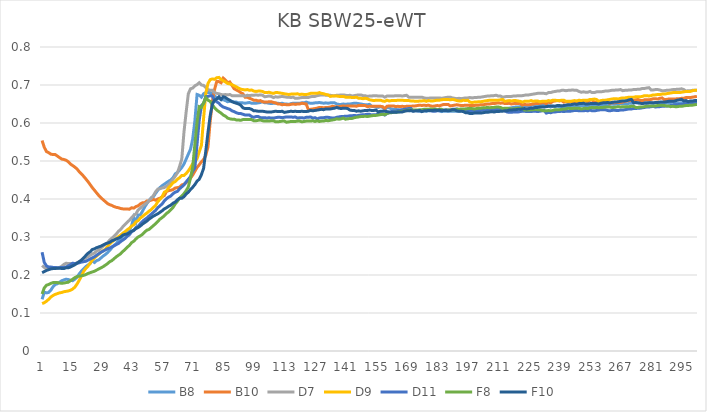
| Category | B8 | B10 | D7 | D9 | D11 | F8 | F10 |
|---|---|---|---|---|---|---|---|
| 0 | 0.136 | 0.554 | 0.225 | 0.125 | 0.26 | 0.15 | 0.206 |
| 1 | 0.155 | 0.536 | 0.22 | 0.127 | 0.233 | 0.166 | 0.209 |
| 2 | 0.153 | 0.525 | 0.217 | 0.131 | 0.224 | 0.173 | 0.212 |
| 3 | 0.154 | 0.522 | 0.218 | 0.136 | 0.221 | 0.175 | 0.214 |
| 4 | 0.16 | 0.518 | 0.218 | 0.142 | 0.221 | 0.178 | 0.216 |
| 5 | 0.169 | 0.517 | 0.217 | 0.146 | 0.22 | 0.18 | 0.217 |
| 6 | 0.175 | 0.517 | 0.217 | 0.149 | 0.22 | 0.18 | 0.217 |
| 7 | 0.177 | 0.513 | 0.218 | 0.151 | 0.219 | 0.18 | 0.218 |
| 8 | 0.181 | 0.509 | 0.22 | 0.153 | 0.219 | 0.179 | 0.218 |
| 9 | 0.185 | 0.505 | 0.223 | 0.154 | 0.22 | 0.178 | 0.217 |
| 10 | 0.187 | 0.504 | 0.228 | 0.156 | 0.22 | 0.179 | 0.217 |
| 11 | 0.189 | 0.502 | 0.231 | 0.157 | 0.221 | 0.18 | 0.219 |
| 12 | 0.188 | 0.498 | 0.23 | 0.158 | 0.224 | 0.181 | 0.219 |
| 13 | 0.186 | 0.492 | 0.23 | 0.16 | 0.227 | 0.185 | 0.221 |
| 14 | 0.185 | 0.488 | 0.23 | 0.163 | 0.231 | 0.189 | 0.224 |
| 15 | 0.189 | 0.484 | 0.23 | 0.168 | 0.23 | 0.193 | 0.227 |
| 16 | 0.194 | 0.479 | 0.232 | 0.176 | 0.231 | 0.196 | 0.231 |
| 17 | 0.203 | 0.472 | 0.235 | 0.186 | 0.232 | 0.197 | 0.235 |
| 18 | 0.21 | 0.466 | 0.239 | 0.197 | 0.234 | 0.198 | 0.239 |
| 19 | 0.216 | 0.46 | 0.242 | 0.209 | 0.235 | 0.199 | 0.245 |
| 20 | 0.222 | 0.453 | 0.245 | 0.217 | 0.236 | 0.201 | 0.251 |
| 21 | 0.226 | 0.446 | 0.248 | 0.223 | 0.239 | 0.204 | 0.257 |
| 22 | 0.23 | 0.438 | 0.252 | 0.231 | 0.242 | 0.206 | 0.261 |
| 23 | 0.238 | 0.43 | 0.255 | 0.239 | 0.245 | 0.208 | 0.267 |
| 24 | 0.233 | 0.423 | 0.258 | 0.245 | 0.248 | 0.21 | 0.269 |
| 25 | 0.238 | 0.416 | 0.263 | 0.25 | 0.252 | 0.213 | 0.272 |
| 26 | 0.24 | 0.409 | 0.266 | 0.255 | 0.256 | 0.216 | 0.274 |
| 27 | 0.245 | 0.403 | 0.271 | 0.26 | 0.26 | 0.219 | 0.276 |
| 28 | 0.25 | 0.398 | 0.276 | 0.264 | 0.263 | 0.222 | 0.279 |
| 29 | 0.254 | 0.393 | 0.281 | 0.268 | 0.266 | 0.226 | 0.282 |
| 30 | 0.259 | 0.388 | 0.285 | 0.275 | 0.269 | 0.23 | 0.284 |
| 31 | 0.265 | 0.385 | 0.292 | 0.282 | 0.271 | 0.235 | 0.286 |
| 32 | 0.272 | 0.383 | 0.297 | 0.287 | 0.274 | 0.238 | 0.29 |
| 33 | 0.278 | 0.38 | 0.302 | 0.292 | 0.277 | 0.243 | 0.292 |
| 34 | 0.283 | 0.378 | 0.308 | 0.296 | 0.28 | 0.248 | 0.295 |
| 35 | 0.29 | 0.377 | 0.315 | 0.301 | 0.283 | 0.252 | 0.297 |
| 36 | 0.296 | 0.375 | 0.32 | 0.305 | 0.288 | 0.256 | 0.3 |
| 37 | 0.302 | 0.374 | 0.327 | 0.31 | 0.292 | 0.262 | 0.305 |
| 38 | 0.308 | 0.374 | 0.333 | 0.314 | 0.296 | 0.267 | 0.307 |
| 39 | 0.314 | 0.374 | 0.339 | 0.319 | 0.302 | 0.273 | 0.308 |
| 40 | 0.319 | 0.373 | 0.344 | 0.323 | 0.306 | 0.278 | 0.311 |
| 41 | 0.329 | 0.377 | 0.351 | 0.329 | 0.314 | 0.285 | 0.315 |
| 42 | 0.352 | 0.376 | 0.357 | 0.332 | 0.317 | 0.289 | 0.318 |
| 43 | 0.339 | 0.38 | 0.361 | 0.34 | 0.325 | 0.295 | 0.322 |
| 44 | 0.358 | 0.382 | 0.371 | 0.343 | 0.328 | 0.3 | 0.325 |
| 45 | 0.358 | 0.387 | 0.376 | 0.35 | 0.335 | 0.303 | 0.329 |
| 46 | 0.368 | 0.39 | 0.381 | 0.354 | 0.341 | 0.307 | 0.334 |
| 47 | 0.379 | 0.39 | 0.386 | 0.359 | 0.346 | 0.313 | 0.338 |
| 48 | 0.388 | 0.395 | 0.39 | 0.363 | 0.35 | 0.318 | 0.342 |
| 49 | 0.396 | 0.395 | 0.396 | 0.368 | 0.355 | 0.32 | 0.347 |
| 50 | 0.403 | 0.397 | 0.402 | 0.372 | 0.36 | 0.325 | 0.351 |
| 51 | 0.406 | 0.399 | 0.409 | 0.378 | 0.365 | 0.33 | 0.355 |
| 52 | 0.415 | 0.397 | 0.419 | 0.383 | 0.37 | 0.335 | 0.358 |
| 53 | 0.423 | 0.4 | 0.426 | 0.393 | 0.377 | 0.341 | 0.361 |
| 54 | 0.43 | 0.402 | 0.427 | 0.399 | 0.382 | 0.347 | 0.365 |
| 55 | 0.435 | 0.406 | 0.429 | 0.406 | 0.387 | 0.351 | 0.369 |
| 56 | 0.439 | 0.409 | 0.43 | 0.418 | 0.395 | 0.356 | 0.374 |
| 57 | 0.443 | 0.42 | 0.434 | 0.421 | 0.401 | 0.362 | 0.377 |
| 58 | 0.447 | 0.422 | 0.438 | 0.43 | 0.405 | 0.366 | 0.381 |
| 59 | 0.45 | 0.423 | 0.445 | 0.436 | 0.408 | 0.372 | 0.384 |
| 60 | 0.456 | 0.425 | 0.452 | 0.443 | 0.414 | 0.378 | 0.389 |
| 61 | 0.466 | 0.429 | 0.46 | 0.446 | 0.418 | 0.387 | 0.392 |
| 62 | 0.47 | 0.43 | 0.469 | 0.452 | 0.42 | 0.394 | 0.398 |
| 63 | 0.476 | 0.431 | 0.486 | 0.456 | 0.427 | 0.402 | 0.402 |
| 64 | 0.483 | 0.437 | 0.505 | 0.462 | 0.432 | 0.408 | 0.402 |
| 65 | 0.492 | 0.439 | 0.576 | 0.462 | 0.437 | 0.414 | 0.406 |
| 66 | 0.505 | 0.443 | 0.629 | 0.467 | 0.445 | 0.422 | 0.413 |
| 67 | 0.518 | 0.448 | 0.677 | 0.474 | 0.452 | 0.432 | 0.418 |
| 68 | 0.531 | 0.455 | 0.69 | 0.483 | 0.459 | 0.455 | 0.425 |
| 69 | 0.558 | 0.463 | 0.692 | 0.493 | 0.473 | 0.484 | 0.431 |
| 70 | 0.606 | 0.473 | 0.698 | 0.498 | 0.482 | 0.544 | 0.438 |
| 71 | 0.675 | 0.483 | 0.701 | 0.506 | 0.545 | 0.602 | 0.447 |
| 72 | 0.673 | 0.49 | 0.706 | 0.524 | 0.608 | 0.643 | 0.452 |
| 73 | 0.668 | 0.498 | 0.7 | 0.541 | 0.646 | 0.641 | 0.464 |
| 74 | 0.677 | 0.504 | 0.699 | 0.613 | 0.652 | 0.653 | 0.481 |
| 75 | 0.68 | 0.515 | 0.693 | 0.678 | 0.669 | 0.667 | 0.526 |
| 76 | 0.68 | 0.537 | 0.688 | 0.704 | 0.67 | 0.66 | 0.575 |
| 77 | 0.68 | 0.604 | 0.686 | 0.714 | 0.672 | 0.657 | 0.619 |
| 78 | 0.677 | 0.657 | 0.686 | 0.716 | 0.671 | 0.648 | 0.649 |
| 79 | 0.671 | 0.688 | 0.68 | 0.715 | 0.659 | 0.64 | 0.66 |
| 80 | 0.667 | 0.709 | 0.678 | 0.719 | 0.656 | 0.634 | 0.663 |
| 81 | 0.664 | 0.709 | 0.677 | 0.72 | 0.652 | 0.63 | 0.669 |
| 82 | 0.662 | 0.706 | 0.675 | 0.715 | 0.646 | 0.626 | 0.662 |
| 83 | 0.661 | 0.718 | 0.674 | 0.711 | 0.642 | 0.621 | 0.669 |
| 84 | 0.659 | 0.713 | 0.675 | 0.708 | 0.64 | 0.618 | 0.667 |
| 85 | 0.656 | 0.706 | 0.674 | 0.704 | 0.638 | 0.613 | 0.663 |
| 86 | 0.657 | 0.708 | 0.675 | 0.703 | 0.636 | 0.611 | 0.66 |
| 87 | 0.657 | 0.699 | 0.672 | 0.701 | 0.632 | 0.61 | 0.656 |
| 88 | 0.655 | 0.69 | 0.672 | 0.698 | 0.63 | 0.61 | 0.654 |
| 89 | 0.655 | 0.687 | 0.672 | 0.695 | 0.627 | 0.608 | 0.652 |
| 90 | 0.653 | 0.684 | 0.672 | 0.692 | 0.625 | 0.608 | 0.65 |
| 91 | 0.653 | 0.68 | 0.672 | 0.689 | 0.625 | 0.607 | 0.647 |
| 92 | 0.653 | 0.677 | 0.672 | 0.688 | 0.623 | 0.609 | 0.64 |
| 93 | 0.652 | 0.668 | 0.671 | 0.687 | 0.621 | 0.609 | 0.638 |
| 94 | 0.653 | 0.668 | 0.673 | 0.688 | 0.621 | 0.609 | 0.638 |
| 95 | 0.654 | 0.665 | 0.672 | 0.686 | 0.621 | 0.609 | 0.638 |
| 96 | 0.652 | 0.663 | 0.673 | 0.687 | 0.617 | 0.609 | 0.636 |
| 97 | 0.652 | 0.66 | 0.673 | 0.684 | 0.615 | 0.606 | 0.632 |
| 98 | 0.652 | 0.66 | 0.674 | 0.683 | 0.617 | 0.606 | 0.632 |
| 99 | 0.653 | 0.658 | 0.673 | 0.684 | 0.617 | 0.607 | 0.631 |
| 100 | 0.654 | 0.659 | 0.674 | 0.684 | 0.614 | 0.608 | 0.631 |
| 101 | 0.656 | 0.656 | 0.673 | 0.683 | 0.614 | 0.606 | 0.631 |
| 102 | 0.653 | 0.655 | 0.669 | 0.68 | 0.614 | 0.605 | 0.63 |
| 103 | 0.653 | 0.655 | 0.67 | 0.68 | 0.613 | 0.605 | 0.629 |
| 104 | 0.652 | 0.656 | 0.671 | 0.681 | 0.614 | 0.605 | 0.629 |
| 105 | 0.651 | 0.656 | 0.67 | 0.679 | 0.613 | 0.606 | 0.629 |
| 106 | 0.652 | 0.654 | 0.667 | 0.678 | 0.613 | 0.606 | 0.63 |
| 107 | 0.652 | 0.653 | 0.669 | 0.68 | 0.614 | 0.603 | 0.631 |
| 108 | 0.652 | 0.65 | 0.668 | 0.68 | 0.615 | 0.603 | 0.63 |
| 109 | 0.651 | 0.65 | 0.669 | 0.679 | 0.615 | 0.604 | 0.63 |
| 110 | 0.652 | 0.648 | 0.67 | 0.678 | 0.614 | 0.605 | 0.631 |
| 111 | 0.65 | 0.649 | 0.669 | 0.677 | 0.615 | 0.605 | 0.628 |
| 112 | 0.65 | 0.648 | 0.668 | 0.676 | 0.616 | 0.602 | 0.629 |
| 113 | 0.649 | 0.648 | 0.668 | 0.675 | 0.616 | 0.603 | 0.63 |
| 114 | 0.651 | 0.649 | 0.667 | 0.676 | 0.616 | 0.604 | 0.631 |
| 115 | 0.652 | 0.65 | 0.668 | 0.676 | 0.615 | 0.604 | 0.63 |
| 116 | 0.652 | 0.649 | 0.665 | 0.676 | 0.616 | 0.604 | 0.631 |
| 117 | 0.652 | 0.65 | 0.665 | 0.677 | 0.613 | 0.605 | 0.63 |
| 118 | 0.652 | 0.65 | 0.666 | 0.675 | 0.614 | 0.605 | 0.63 |
| 119 | 0.653 | 0.652 | 0.667 | 0.676 | 0.614 | 0.603 | 0.631 |
| 120 | 0.653 | 0.651 | 0.667 | 0.675 | 0.613 | 0.604 | 0.63 |
| 121 | 0.655 | 0.65 | 0.667 | 0.675 | 0.615 | 0.605 | 0.63 |
| 122 | 0.653 | 0.635 | 0.667 | 0.676 | 0.615 | 0.605 | 0.631 |
| 123 | 0.652 | 0.636 | 0.669 | 0.678 | 0.616 | 0.605 | 0.633 |
| 124 | 0.652 | 0.637 | 0.67 | 0.678 | 0.613 | 0.606 | 0.632 |
| 125 | 0.653 | 0.638 | 0.67 | 0.678 | 0.614 | 0.604 | 0.633 |
| 126 | 0.653 | 0.639 | 0.672 | 0.678 | 0.611 | 0.606 | 0.634 |
| 127 | 0.654 | 0.641 | 0.673 | 0.68 | 0.613 | 0.604 | 0.635 |
| 128 | 0.653 | 0.641 | 0.674 | 0.678 | 0.614 | 0.605 | 0.636 |
| 129 | 0.652 | 0.64 | 0.674 | 0.677 | 0.614 | 0.605 | 0.635 |
| 130 | 0.653 | 0.641 | 0.673 | 0.675 | 0.615 | 0.607 | 0.637 |
| 131 | 0.652 | 0.641 | 0.673 | 0.674 | 0.615 | 0.606 | 0.637 |
| 132 | 0.653 | 0.642 | 0.673 | 0.67 | 0.614 | 0.607 | 0.637 |
| 133 | 0.653 | 0.644 | 0.672 | 0.671 | 0.613 | 0.608 | 0.638 |
| 134 | 0.653 | 0.643 | 0.672 | 0.671 | 0.613 | 0.609 | 0.639 |
| 135 | 0.65 | 0.643 | 0.673 | 0.671 | 0.615 | 0.611 | 0.641 |
| 136 | 0.649 | 0.643 | 0.673 | 0.67 | 0.616 | 0.61 | 0.639 |
| 137 | 0.649 | 0.644 | 0.674 | 0.67 | 0.617 | 0.611 | 0.638 |
| 138 | 0.65 | 0.645 | 0.674 | 0.67 | 0.617 | 0.613 | 0.639 |
| 139 | 0.649 | 0.644 | 0.673 | 0.668 | 0.618 | 0.61 | 0.639 |
| 140 | 0.65 | 0.645 | 0.672 | 0.668 | 0.618 | 0.611 | 0.638 |
| 141 | 0.65 | 0.645 | 0.673 | 0.668 | 0.619 | 0.612 | 0.634 |
| 142 | 0.651 | 0.645 | 0.671 | 0.667 | 0.619 | 0.612 | 0.633 |
| 143 | 0.652 | 0.645 | 0.672 | 0.667 | 0.62 | 0.614 | 0.633 |
| 144 | 0.652 | 0.644 | 0.673 | 0.668 | 0.619 | 0.615 | 0.631 |
| 145 | 0.651 | 0.646 | 0.674 | 0.665 | 0.62 | 0.616 | 0.632 |
| 146 | 0.65 | 0.646 | 0.674 | 0.665 | 0.621 | 0.617 | 0.631 |
| 147 | 0.649 | 0.646 | 0.672 | 0.664 | 0.622 | 0.617 | 0.632 |
| 148 | 0.648 | 0.646 | 0.672 | 0.665 | 0.622 | 0.618 | 0.633 |
| 149 | 0.648 | 0.643 | 0.67 | 0.664 | 0.623 | 0.617 | 0.633 |
| 150 | 0.649 | 0.644 | 0.671 | 0.661 | 0.623 | 0.618 | 0.634 |
| 151 | 0.644 | 0.644 | 0.671 | 0.66 | 0.621 | 0.619 | 0.633 |
| 152 | 0.643 | 0.644 | 0.672 | 0.659 | 0.622 | 0.62 | 0.633 |
| 153 | 0.642 | 0.644 | 0.672 | 0.66 | 0.622 | 0.62 | 0.634 |
| 154 | 0.641 | 0.644 | 0.671 | 0.66 | 0.623 | 0.621 | 0.629 |
| 155 | 0.643 | 0.644 | 0.671 | 0.66 | 0.624 | 0.622 | 0.631 |
| 156 | 0.641 | 0.643 | 0.671 | 0.658 | 0.623 | 0.623 | 0.631 |
| 157 | 0.635 | 0.638 | 0.668 | 0.657 | 0.621 | 0.622 | 0.631 |
| 158 | 0.641 | 0.644 | 0.671 | 0.66 | 0.625 | 0.625 | 0.63 |
| 159 | 0.64 | 0.645 | 0.671 | 0.658 | 0.627 | 0.627 | 0.629 |
| 160 | 0.637 | 0.645 | 0.671 | 0.659 | 0.63 | 0.627 | 0.628 |
| 161 | 0.636 | 0.645 | 0.671 | 0.659 | 0.631 | 0.628 | 0.628 |
| 162 | 0.636 | 0.643 | 0.672 | 0.659 | 0.631 | 0.628 | 0.628 |
| 163 | 0.635 | 0.644 | 0.672 | 0.66 | 0.633 | 0.629 | 0.629 |
| 164 | 0.634 | 0.643 | 0.672 | 0.66 | 0.634 | 0.63 | 0.629 |
| 165 | 0.633 | 0.644 | 0.671 | 0.66 | 0.635 | 0.631 | 0.629 |
| 166 | 0.634 | 0.643 | 0.672 | 0.659 | 0.636 | 0.632 | 0.631 |
| 167 | 0.633 | 0.644 | 0.673 | 0.659 | 0.637 | 0.633 | 0.632 |
| 168 | 0.633 | 0.644 | 0.668 | 0.659 | 0.638 | 0.634 | 0.632 |
| 169 | 0.632 | 0.644 | 0.668 | 0.658 | 0.638 | 0.634 | 0.633 |
| 170 | 0.632 | 0.645 | 0.668 | 0.658 | 0.632 | 0.634 | 0.631 |
| 171 | 0.632 | 0.645 | 0.668 | 0.657 | 0.633 | 0.634 | 0.632 |
| 172 | 0.632 | 0.646 | 0.668 | 0.657 | 0.632 | 0.634 | 0.632 |
| 173 | 0.631 | 0.647 | 0.668 | 0.658 | 0.632 | 0.635 | 0.633 |
| 174 | 0.631 | 0.646 | 0.668 | 0.658 | 0.632 | 0.635 | 0.63 |
| 175 | 0.632 | 0.647 | 0.666 | 0.659 | 0.634 | 0.636 | 0.632 |
| 176 | 0.631 | 0.646 | 0.665 | 0.657 | 0.633 | 0.636 | 0.632 |
| 177 | 0.632 | 0.647 | 0.665 | 0.659 | 0.633 | 0.636 | 0.633 |
| 178 | 0.633 | 0.645 | 0.666 | 0.658 | 0.632 | 0.637 | 0.633 |
| 179 | 0.633 | 0.644 | 0.666 | 0.658 | 0.631 | 0.636 | 0.633 |
| 180 | 0.633 | 0.645 | 0.666 | 0.659 | 0.631 | 0.637 | 0.634 |
| 181 | 0.634 | 0.646 | 0.666 | 0.66 | 0.632 | 0.635 | 0.633 |
| 182 | 0.632 | 0.645 | 0.666 | 0.66 | 0.632 | 0.636 | 0.634 |
| 183 | 0.63 | 0.647 | 0.665 | 0.661 | 0.633 | 0.636 | 0.632 |
| 184 | 0.631 | 0.649 | 0.666 | 0.662 | 0.634 | 0.633 | 0.633 |
| 185 | 0.631 | 0.649 | 0.667 | 0.662 | 0.635 | 0.634 | 0.633 |
| 186 | 0.631 | 0.649 | 0.668 | 0.662 | 0.634 | 0.634 | 0.632 |
| 187 | 0.631 | 0.645 | 0.668 | 0.661 | 0.634 | 0.634 | 0.633 |
| 188 | 0.631 | 0.646 | 0.666 | 0.662 | 0.636 | 0.635 | 0.635 |
| 189 | 0.631 | 0.647 | 0.665 | 0.661 | 0.636 | 0.635 | 0.635 |
| 190 | 0.631 | 0.648 | 0.664 | 0.659 | 0.637 | 0.636 | 0.632 |
| 191 | 0.631 | 0.647 | 0.665 | 0.658 | 0.634 | 0.636 | 0.631 |
| 192 | 0.632 | 0.646 | 0.664 | 0.658 | 0.633 | 0.637 | 0.631 |
| 193 | 0.632 | 0.646 | 0.665 | 0.66 | 0.635 | 0.637 | 0.63 |
| 194 | 0.632 | 0.647 | 0.666 | 0.659 | 0.636 | 0.637 | 0.627 |
| 195 | 0.632 | 0.647 | 0.666 | 0.66 | 0.632 | 0.638 | 0.627 |
| 196 | 0.633 | 0.646 | 0.667 | 0.655 | 0.632 | 0.638 | 0.625 |
| 197 | 0.633 | 0.646 | 0.666 | 0.654 | 0.632 | 0.638 | 0.625 |
| 198 | 0.634 | 0.646 | 0.667 | 0.655 | 0.632 | 0.637 | 0.626 |
| 199 | 0.634 | 0.647 | 0.667 | 0.655 | 0.632 | 0.638 | 0.626 |
| 200 | 0.635 | 0.647 | 0.668 | 0.656 | 0.633 | 0.639 | 0.626 |
| 201 | 0.636 | 0.648 | 0.668 | 0.656 | 0.633 | 0.639 | 0.626 |
| 202 | 0.636 | 0.648 | 0.669 | 0.657 | 0.634 | 0.64 | 0.627 |
| 203 | 0.634 | 0.649 | 0.67 | 0.658 | 0.632 | 0.64 | 0.628 |
| 204 | 0.634 | 0.65 | 0.671 | 0.659 | 0.633 | 0.641 | 0.628 |
| 205 | 0.635 | 0.65 | 0.671 | 0.66 | 0.634 | 0.64 | 0.629 |
| 206 | 0.636 | 0.651 | 0.672 | 0.66 | 0.635 | 0.641 | 0.63 |
| 207 | 0.636 | 0.651 | 0.672 | 0.66 | 0.635 | 0.641 | 0.629 |
| 208 | 0.637 | 0.652 | 0.673 | 0.66 | 0.636 | 0.642 | 0.63 |
| 209 | 0.637 | 0.653 | 0.671 | 0.66 | 0.635 | 0.642 | 0.63 |
| 210 | 0.637 | 0.652 | 0.671 | 0.661 | 0.636 | 0.641 | 0.631 |
| 211 | 0.637 | 0.653 | 0.668 | 0.662 | 0.636 | 0.638 | 0.631 |
| 212 | 0.637 | 0.651 | 0.669 | 0.657 | 0.632 | 0.639 | 0.632 |
| 213 | 0.638 | 0.651 | 0.67 | 0.658 | 0.629 | 0.639 | 0.632 |
| 214 | 0.639 | 0.652 | 0.67 | 0.659 | 0.628 | 0.638 | 0.634 |
| 215 | 0.64 | 0.65 | 0.67 | 0.658 | 0.628 | 0.637 | 0.634 |
| 216 | 0.641 | 0.651 | 0.671 | 0.659 | 0.629 | 0.637 | 0.635 |
| 217 | 0.642 | 0.651 | 0.671 | 0.659 | 0.629 | 0.638 | 0.635 |
| 218 | 0.642 | 0.651 | 0.672 | 0.658 | 0.629 | 0.639 | 0.636 |
| 219 | 0.643 | 0.652 | 0.672 | 0.657 | 0.63 | 0.638 | 0.636 |
| 220 | 0.644 | 0.647 | 0.672 | 0.655 | 0.631 | 0.639 | 0.637 |
| 221 | 0.645 | 0.649 | 0.673 | 0.657 | 0.631 | 0.634 | 0.638 |
| 222 | 0.645 | 0.648 | 0.674 | 0.657 | 0.63 | 0.634 | 0.637 |
| 223 | 0.646 | 0.648 | 0.674 | 0.657 | 0.63 | 0.634 | 0.638 |
| 224 | 0.646 | 0.649 | 0.675 | 0.659 | 0.63 | 0.635 | 0.639 |
| 225 | 0.647 | 0.65 | 0.676 | 0.657 | 0.631 | 0.635 | 0.639 |
| 226 | 0.647 | 0.651 | 0.677 | 0.658 | 0.631 | 0.636 | 0.641 |
| 227 | 0.648 | 0.651 | 0.678 | 0.658 | 0.63 | 0.635 | 0.641 |
| 228 | 0.649 | 0.652 | 0.678 | 0.656 | 0.631 | 0.635 | 0.642 |
| 229 | 0.649 | 0.653 | 0.678 | 0.657 | 0.632 | 0.633 | 0.642 |
| 230 | 0.649 | 0.653 | 0.678 | 0.657 | 0.633 | 0.632 | 0.642 |
| 231 | 0.647 | 0.651 | 0.677 | 0.657 | 0.626 | 0.632 | 0.643 |
| 232 | 0.645 | 0.655 | 0.68 | 0.659 | 0.628 | 0.633 | 0.644 |
| 233 | 0.642 | 0.653 | 0.68 | 0.658 | 0.627 | 0.632 | 0.645 |
| 234 | 0.645 | 0.657 | 0.682 | 0.66 | 0.629 | 0.633 | 0.644 |
| 235 | 0.644 | 0.658 | 0.683 | 0.66 | 0.629 | 0.635 | 0.644 |
| 236 | 0.644 | 0.659 | 0.684 | 0.659 | 0.63 | 0.635 | 0.646 |
| 237 | 0.643 | 0.658 | 0.684 | 0.659 | 0.63 | 0.635 | 0.646 |
| 238 | 0.642 | 0.659 | 0.686 | 0.66 | 0.631 | 0.636 | 0.645 |
| 239 | 0.642 | 0.655 | 0.686 | 0.66 | 0.63 | 0.637 | 0.646 |
| 240 | 0.643 | 0.656 | 0.685 | 0.657 | 0.631 | 0.637 | 0.647 |
| 241 | 0.642 | 0.655 | 0.686 | 0.657 | 0.631 | 0.639 | 0.648 |
| 242 | 0.643 | 0.656 | 0.686 | 0.657 | 0.631 | 0.638 | 0.648 |
| 243 | 0.642 | 0.656 | 0.687 | 0.658 | 0.632 | 0.638 | 0.649 |
| 244 | 0.643 | 0.655 | 0.686 | 0.659 | 0.633 | 0.639 | 0.65 |
| 245 | 0.644 | 0.656 | 0.686 | 0.658 | 0.633 | 0.639 | 0.649 |
| 246 | 0.645 | 0.657 | 0.683 | 0.66 | 0.632 | 0.639 | 0.651 |
| 247 | 0.646 | 0.657 | 0.681 | 0.659 | 0.632 | 0.637 | 0.651 |
| 248 | 0.645 | 0.657 | 0.682 | 0.66 | 0.632 | 0.638 | 0.652 |
| 249 | 0.646 | 0.658 | 0.681 | 0.66 | 0.633 | 0.639 | 0.65 |
| 250 | 0.643 | 0.656 | 0.681 | 0.66 | 0.632 | 0.638 | 0.65 |
| 251 | 0.647 | 0.66 | 0.683 | 0.662 | 0.634 | 0.64 | 0.651 |
| 252 | 0.645 | 0.661 | 0.68 | 0.662 | 0.632 | 0.641 | 0.651 |
| 253 | 0.646 | 0.654 | 0.68 | 0.663 | 0.632 | 0.64 | 0.651 |
| 254 | 0.646 | 0.654 | 0.682 | 0.662 | 0.633 | 0.641 | 0.651 |
| 255 | 0.647 | 0.654 | 0.682 | 0.657 | 0.634 | 0.64 | 0.65 |
| 256 | 0.648 | 0.656 | 0.682 | 0.659 | 0.635 | 0.641 | 0.652 |
| 257 | 0.647 | 0.657 | 0.683 | 0.66 | 0.635 | 0.641 | 0.653 |
| 258 | 0.647 | 0.655 | 0.684 | 0.66 | 0.635 | 0.642 | 0.653 |
| 259 | 0.648 | 0.655 | 0.684 | 0.661 | 0.633 | 0.642 | 0.654 |
| 260 | 0.649 | 0.652 | 0.685 | 0.662 | 0.632 | 0.642 | 0.653 |
| 261 | 0.65 | 0.653 | 0.686 | 0.663 | 0.633 | 0.641 | 0.654 |
| 262 | 0.649 | 0.653 | 0.686 | 0.664 | 0.634 | 0.641 | 0.655 |
| 263 | 0.65 | 0.654 | 0.687 | 0.664 | 0.633 | 0.642 | 0.655 |
| 264 | 0.65 | 0.654 | 0.687 | 0.663 | 0.633 | 0.643 | 0.656 |
| 265 | 0.651 | 0.654 | 0.688 | 0.665 | 0.634 | 0.642 | 0.657 |
| 266 | 0.651 | 0.655 | 0.685 | 0.666 | 0.634 | 0.643 | 0.658 |
| 267 | 0.651 | 0.657 | 0.686 | 0.666 | 0.635 | 0.643 | 0.658 |
| 268 | 0.65 | 0.658 | 0.686 | 0.667 | 0.636 | 0.643 | 0.659 |
| 269 | 0.652 | 0.659 | 0.687 | 0.668 | 0.637 | 0.643 | 0.661 |
| 270 | 0.652 | 0.659 | 0.687 | 0.668 | 0.637 | 0.644 | 0.662 |
| 271 | 0.653 | 0.66 | 0.688 | 0.668 | 0.638 | 0.644 | 0.653 |
| 272 | 0.653 | 0.661 | 0.688 | 0.669 | 0.638 | 0.641 | 0.654 |
| 273 | 0.653 | 0.662 | 0.689 | 0.669 | 0.639 | 0.641 | 0.653 |
| 274 | 0.654 | 0.659 | 0.689 | 0.669 | 0.639 | 0.642 | 0.652 |
| 275 | 0.654 | 0.659 | 0.691 | 0.67 | 0.64 | 0.642 | 0.651 |
| 276 | 0.654 | 0.661 | 0.691 | 0.672 | 0.641 | 0.643 | 0.652 |
| 277 | 0.655 | 0.661 | 0.692 | 0.672 | 0.642 | 0.644 | 0.652 |
| 278 | 0.654 | 0.661 | 0.693 | 0.671 | 0.642 | 0.645 | 0.653 |
| 279 | 0.653 | 0.662 | 0.687 | 0.672 | 0.643 | 0.645 | 0.653 |
| 280 | 0.652 | 0.664 | 0.687 | 0.674 | 0.644 | 0.645 | 0.653 |
| 281 | 0.653 | 0.664 | 0.688 | 0.674 | 0.642 | 0.645 | 0.654 |
| 282 | 0.653 | 0.663 | 0.688 | 0.675 | 0.643 | 0.646 | 0.654 |
| 283 | 0.652 | 0.665 | 0.687 | 0.675 | 0.643 | 0.647 | 0.655 |
| 284 | 0.653 | 0.666 | 0.685 | 0.676 | 0.644 | 0.647 | 0.655 |
| 285 | 0.653 | 0.662 | 0.685 | 0.676 | 0.644 | 0.646 | 0.655 |
| 286 | 0.654 | 0.662 | 0.686 | 0.677 | 0.645 | 0.645 | 0.656 |
| 287 | 0.654 | 0.663 | 0.686 | 0.678 | 0.645 | 0.645 | 0.657 |
| 288 | 0.654 | 0.663 | 0.687 | 0.679 | 0.646 | 0.643 | 0.657 |
| 289 | 0.655 | 0.663 | 0.688 | 0.68 | 0.647 | 0.644 | 0.657 |
| 290 | 0.652 | 0.663 | 0.688 | 0.68 | 0.648 | 0.643 | 0.658 |
| 291 | 0.652 | 0.664 | 0.689 | 0.68 | 0.648 | 0.643 | 0.66 |
| 292 | 0.652 | 0.664 | 0.689 | 0.68 | 0.649 | 0.644 | 0.661 |
| 293 | 0.653 | 0.665 | 0.69 | 0.681 | 0.649 | 0.644 | 0.662 |
| 294 | 0.654 | 0.665 | 0.688 | 0.682 | 0.65 | 0.645 | 0.658 |
| 295 | 0.655 | 0.667 | 0.684 | 0.683 | 0.651 | 0.646 | 0.659 |
| 296 | 0.654 | 0.667 | 0.685 | 0.683 | 0.651 | 0.646 | 0.656 |
| 297 | 0.654 | 0.667 | 0.685 | 0.683 | 0.652 | 0.647 | 0.658 |
| 298 | 0.655 | 0.668 | 0.686 | 0.685 | 0.653 | 0.647 | 0.658 |
| 299 | 0.656 | 0.669 | 0.686 | 0.686 | 0.653 | 0.648 | 0.659 |
| 300 | 0.656 | 0.67 | 0.686 | 0.686 | 0.653 | 0.649 | 0.659 |